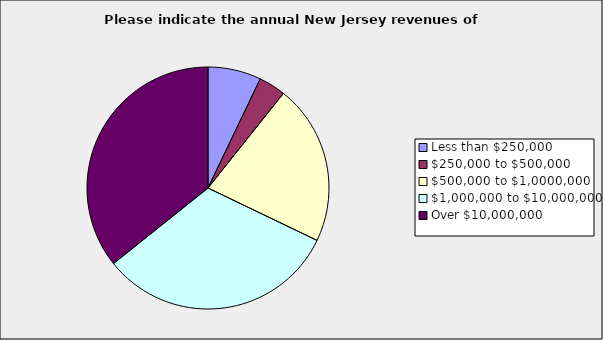
| Category | Series 0 |
|---|---|
| Less than $250,000 | 0.071 |
| $250,000 to $500,000 | 0.036 |
| $500,000 to $1,0000,000 | 0.214 |
| $1,000,000 to $10,000,000 | 0.321 |
| Over $10,000,000 | 0.357 |